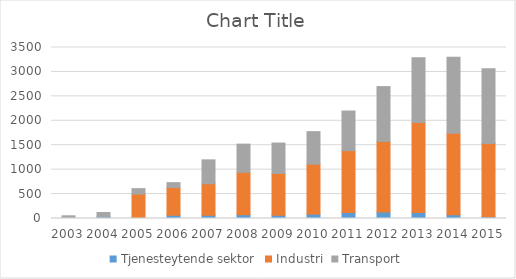
| Category | Tjenesteytende sektor | Industri | Transport |
|---|---|---|---|
| 2003.0 | 0 | 0 | 55.555 |
| 2004.0 | 33.333 | 0 | 88.888 |
| 2005.0 | 22.222 | 477.773 | 111.11 |
| 2006.0 | 66.666 | 566.661 | 99.999 |
| 2007.0 | 66.666 | 644.438 | 488.884 |
| 2008.0 | 77.777 | 866.658 | 577.772 |
| 2009.0 | 66.666 | 855.547 | 622.216 |
| 2010.0 | 88.888 | 1022.212 | 666.66 |
| 2011.0 | 122.221 | 1266.654 | 811.103 |
| 2012.0 | 133.332 | 1444.43 | 1122.211 |
| 2013.0 | 122.221 | 1844.426 | 1322.209 |
| 2014.0 | 77.777 | 1666.65 | 1555.54 |
| 2015.0 | 33.333 | 1499.985 | 1533.318 |